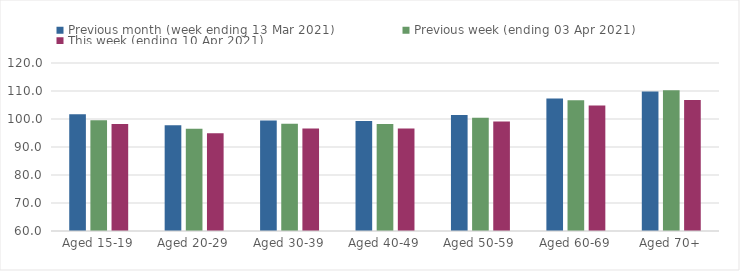
| Category | Previous month (week ending 13 Mar 2021) | Previous week (ending 03 Apr 2021) | This week (ending 10 Apr 2021) |
|---|---|---|---|
| Aged 15-19 | 101.66 | 99.51 | 98.25 |
| Aged 20-29 | 97.74 | 96.54 | 94.87 |
| Aged 30-39 | 99.42 | 98.3 | 96.58 |
| Aged 40-49 | 99.31 | 98.23 | 96.57 |
| Aged 50-59 | 101.43 | 100.49 | 99.07 |
| Aged 60-69 | 107.31 | 106.73 | 104.79 |
| Aged 70+ | 109.83 | 110.3 | 106.79 |